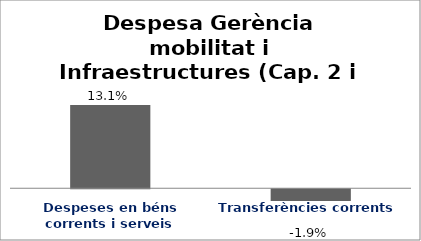
| Category | Series 0 |
|---|---|
| Despeses en béns corrents i serveis | 0.131 |
| Transferències corrents | -0.019 |